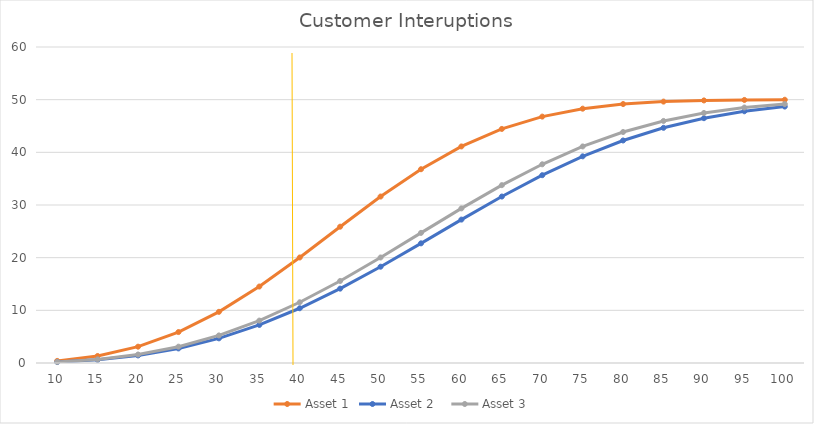
| Category | Asset 1 | Asset 2 | Asset 3 |
|---|---|---|---|
| 10.0 | 0.398 | 0.182 | 0.204 |
| 15.0 | 1.332 | 0.611 | 0.686 |
| 20.0 | 3.1 | 1.436 | 1.612 |
| 25.0 | 5.875 | 2.765 | 3.1 |
| 30.0 | 9.713 | 4.682 | 5.235 |
| 35.0 | 14.518 | 7.227 | 8.053 |
| 40.0 | 20.035 | 10.394 | 11.53 |
| 45.0 | 25.88 | 14.119 | 15.575 |
| 50.0 | 31.606 | 18.283 | 20.035 |
| 55.0 | 36.789 | 22.719 | 24.706 |
| 60.0 | 41.118 | 27.229 | 29.359 |
| 65.0 | 44.443 | 31.606 | 33.765 |
| 70.0 | 46.784 | 35.66 | 37.731 |
| 75.0 | 48.289 | 39.24 | 41.118 |
| 80.0 | 49.168 | 42.25 | 43.86 |
| 85.0 | 49.632 | 44.657 | 45.959 |
| 90.0 | 49.853 | 46.483 | 47.476 |
| 95.0 | 49.948 | 47.797 | 48.508 |
| 100.0 | 49.983 | 48.689 | 49.168 |